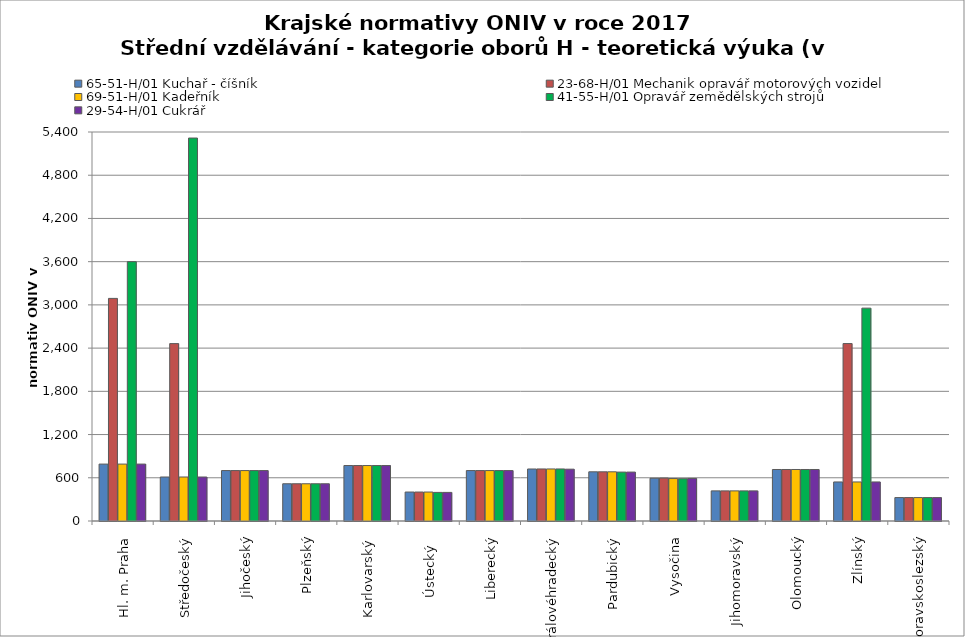
| Category | 65-51-H/01 Kuchař - číšník | 23-68-H/01 Mechanik opravář motorových vozidel | 69-51-H/01 Kadeřník | 41-55-H/01 Opravář zemědělských strojů | 29-54-H/01 Cukrář |
|---|---|---|---|---|---|
| Hl. m. Praha | 790 | 3090 | 790 | 3600 | 790 |
| Středočeský | 610.785 | 2462.368 | 610.785 | 5316.255 | 610.785 |
| Jihočeský | 700 | 700 | 700 | 700 | 700 |
| Plzeňský | 517 | 517 | 517 | 517 | 517 |
| Karlovarský  | 770 | 770 | 770 | 770 | 770 |
| Ústecký   | 402 | 402 | 402 | 397 | 397 |
| Liberecký | 700 | 700 | 700 | 700 | 700 |
| Královéhradecký | 722 | 722.3 | 722.3 | 722.3 | 719.4 |
| Pardubický | 683 | 683 | 683 | 679 | 679 |
| Vysočina | 594 | 596 | 589 | 587 | 591 |
| Jihomoravský | 418 | 418 | 418 | 418 | 418 |
| Olomoucký | 715 | 715 | 715 | 715 | 715 |
| Zlínský | 542 | 2463 | 542 | 2955 | 542 |
| Moravskoslezský | 325 | 325 | 325 | 325 | 325 |